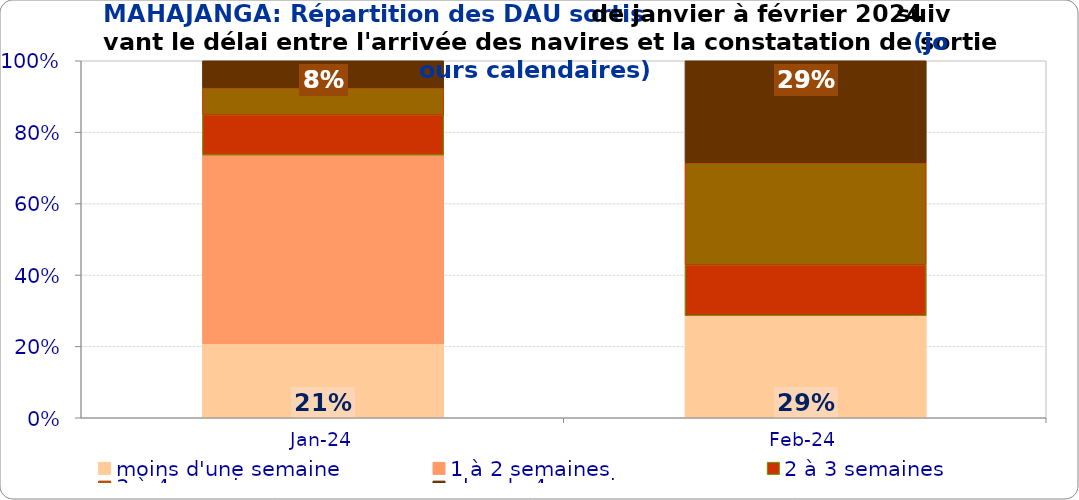
| Category | moins d'une semaine | 1 à 2 semaines | 2 à 3 semaines | 3 à 4 semaines | plus de 4 semaines |
|---|---|---|---|---|---|
| 2024-01-01 | 0.208 | 0.528 | 0.113 | 0.075 | 0.075 |
| 2024-02-01 | 0.286 | 0 | 0.143 | 0.286 | 0.286 |